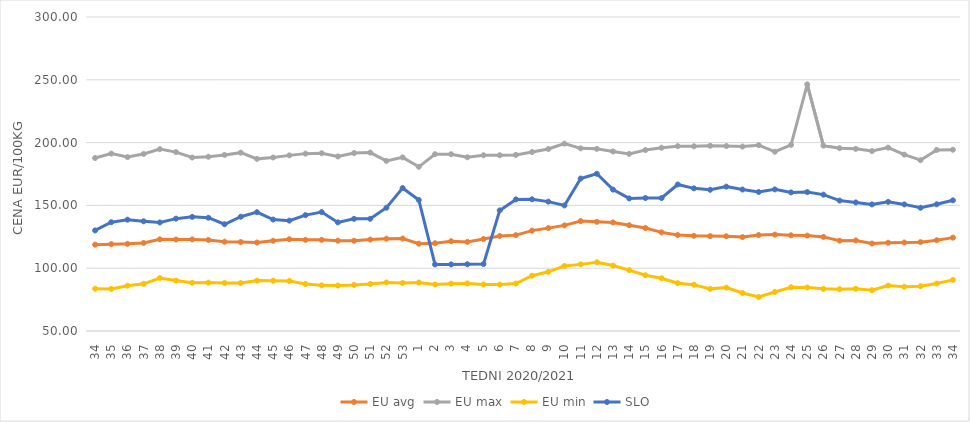
| Category | EU avg | EU max | EU min | SLO |
|---|---|---|---|---|
| 34.0 | 118.75 | 187.74 | 83.66 | 130.07 |
| 35.0 | 119.136 | 191.25 | 83.53 | 136.63 |
| 36.0 | 119.398 | 188.47 | 86.09 | 138.64 |
| 37.0 | 120.135 | 190.99 | 87.57 | 137.35 |
| 38.0 | 122.982 | 194.8 | 92.21 | 136.42 |
| 39.0 | 122.832 | 192.45 | 90.16 | 139.46 |
| 40.0 | 122.936 | 188.11 | 88.45 | 140.87 |
| 41.0 | 122.507 | 188.73 | 88.54 | 140.18 |
| 42.0 | 121.098 | 190.2 | 88.3 | 134.98 |
| 43.0 | 120.822 | 191.99 | 88.22 | 141 |
| 44.0 | 120.448 | 187.06 | 90.13 | 144.61 |
| 45.0 | 121.843 | 188.15 | 90.04 | 138.73 |
| 46.0 | 123.07 | 189.82 | 89.89 | 137.88 |
| 47.0 | 122.58 | 191.22 | 87.43 | 142.27 |
| 48.0 | 122.553 | 191.52 | 86.35 | 144.69 |
| 49.0 | 121.893 | 188.97 | 86.24 | 136.47 |
| 50.0 | 121.851 | 191.67 | 86.72 | 139.29 |
| 51.0 | 122.8 | 192.06 | 87.5 | 139.35 |
| 52.0 | 123.52 | 185.468 | 88.67 | 148.16 |
| 53.0 | 123.611 | 188.25 | 88.23 | 163.81 |
| 1.0 | 119.553 | 180.72 | 88.64 | 154.31 |
| 2.0 | 119.893 | 190.77 | 87.1 | 103.02 |
| 3.0 | 121.489 | 190.76 | 87.7 | 103.03 |
| 4.0 | 120.954 | 188.33 | 87.88 | 103.15 |
| 5.0 | 123.293 | 189.91 | 87.04 | 103.34 |
| 6.0 | 125.679 | 189.94 | 86.97 | 146.03 |
| 7.0 | 126.33 | 190.21 | 87.79 | 154.77 |
| 8.0 | 129.933 | 192.48 | 94.02 | 154.86 |
| 9.0 | 131.908 | 194.884 | 97.12 | 153 |
| 10.0 | 134.098 | 199.17 | 101.79 | 149.98 |
| 11.0 | 137.49 | 195.419 | 103.05 | 171.4 |
| 12.0 | 136.929 | 195.013 | 104.76 | 175.2 |
| 13.0 | 136.39 | 192.952 | 102.11 | 162.57 |
| 14.0 | 134.198 | 191.034 | 98.5 | 155.55 |
| 15.0 | 132.003 | 194.047 | 94.39 | 155.88 |
| 16.0 | 128.53 | 195.913 | 92.04 | 155.88 |
| 17.0 | 126.415 | 197.188 | 88.07 | 166.66 |
| 18.0 | 125.787 | 197.055 | 86.89 | 163.58 |
| 19.0 | 125.54 | 197.478 | 83.546 | 162.44 |
| 20.0 | 125.412 | 197.263 | 84.55 | 164.94 |
| 21.0 | 124.768 | 196.821 | 80.264 | 162.64 |
| 22.0 | 126.43 | 197.963 | 77.048 | 160.68 |
| 23.0 | 126.76 | 192.72 | 81.087 | 162.75 |
| 24.0 | 126.19 | 198.186 | 84.83 | 160.34 |
| 25.0 | 125.97 | 246.36 | 84.63 | 160.6 |
| 26.0 | 124.92 | 197.607 | 83.57 | 158.57 |
| 27.0 | 121.922 | 195.566 | 83.3 | 153.83 |
| 28.0 | 122.106 | 195.043 | 83.64 | 152.35 |
| 29.0 | 119.659 | 193.272 | 82.49 | 150.79 |
| 30.0 | 120.3 | 196.01 | 86.16 | 152.82 |
| 31.0 | 120.473 | 190.42 | 85.26 | 150.8 |
| 32.0 | 120.756 | 186 | 85.65 | 148.1 |
| 33.0 | 122.274 | 194.145 | 87.8 | 150.88 |
| 34.0 | 124.332 | 194.304 | 90.69 | 154.04 |